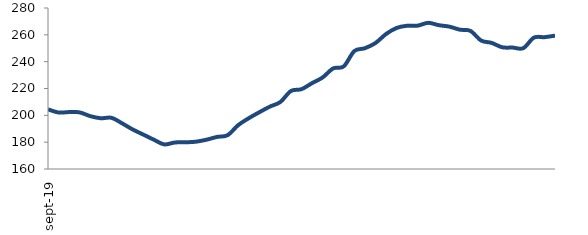
| Category | Series 0 |
|---|---|
| 2019-09-01 | 204.488 |
| 2019-10-01 | 202.111 |
| 2019-11-01 | 202.424 |
| 2019-12-01 | 202.177 |
| 2020-01-01 | 199.409 |
| 2020-02-01 | 197.826 |
| 2020-03-01 | 198.161 |
| 2020-04-01 | 194.123 |
| 2020-05-01 | 189.538 |
| 2020-06-01 | 185.731 |
| 2020-07-01 | 181.914 |
| 2020-08-01 | 178.343 |
| 2020-09-01 | 179.758 |
| 2020-10-01 | 179.9 |
| 2020-11-01 | 180.346 |
| 2020-12-01 | 181.827 |
| 2021-01-01 | 183.909 |
| 2021-02-01 | 185.191 |
| 2021-03-01 | 192.66 |
| 2021-04-01 | 197.814 |
| 2021-05-01 | 202.28 |
| 2021-06-01 | 206.474 |
| 2021-07-01 | 209.951 |
| 2021-08-01 | 218.146 |
| 2021-09-01 | 219.495 |
| 2021-10-01 | 224.001 |
| 2021-11-01 | 228.234 |
| 2021-12-01 | 234.966 |
| 2022-01-01 | 236.495 |
| 2022-02-01 | 247.883 |
| 2022-03-01 | 250.016 |
| 2022-04-01 | 253.872 |
| 2022-05-01 | 260.574 |
| 2022-06-01 | 265.125 |
| 2022-07-01 | 266.79 |
| 2022-08-01 | 266.867 |
| 2022-09-01 | 268.948 |
| 2022-10-01 | 267.186 |
| 2022-11-01 | 266.12 |
| 2022-12-01 | 263.849 |
| 2023-01-01 | 262.911 |
| 2023-02-01 | 255.756 |
| 2023-03-01 | 253.995 |
| 2023-04-01 | 250.72 |
| 2023-05-01 | 250.501 |
| 2023-06-01 | 250.068 |
| 2023-07-01 | 257.894 |
| 2023-08-01 | 258.252 |
| 2023-09-01 | 259.395 |